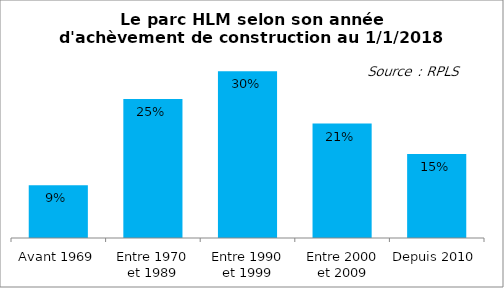
| Category | Series 0 |
|---|---|
| Avant 1969 | 0.095 |
| Entre 1970 et 1989 | 0.25 |
| Entre 1990 et 1999 | 0.299 |
| Entre 2000 et 2009 | 0.206 |
| Depuis 2010 | 0.151 |